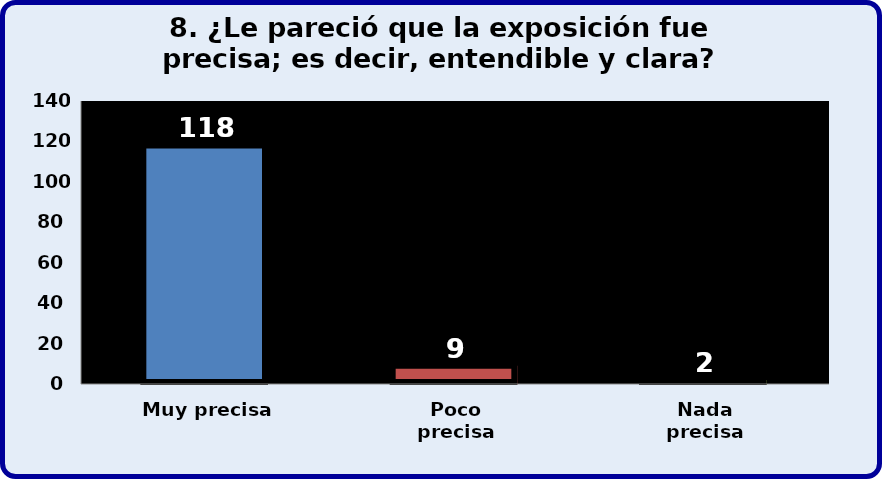
| Category | Series 0 |
|---|---|
| Muy precisa | 118 |
| Poco precisa | 9 |
| Nada precisa | 2 |